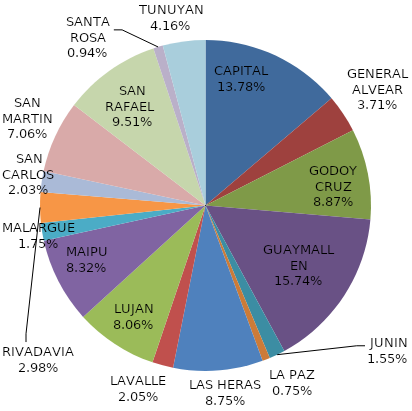
| Category | Total Quiniela Recaudación  |
|---|---|
| CAPITAL | 15851410 |
| GENERAL ALVEAR | 4272815 |
| GODOY CRUZ | 10206025 |
| GUAYMALLEN | 18109534 |
| JUNIN | 1785129 |
| LA PAZ | 858090 |
| LAS HERAS | 10065505 |
| LAVALLE | 2354069 |
| LUJAN | 9274806 |
| MAIPU | 9577993 |
| MALARGUE | 2009662 |
| RIVADAVIA | 3424629 |
| SAN CARLOS | 2342007 |
| SAN MARTIN | 8123848 |
| SAN RAFAEL  | 10945567 |
| SANTA ROSA | 1082656 |
| TUNUYAN | 4782777 |